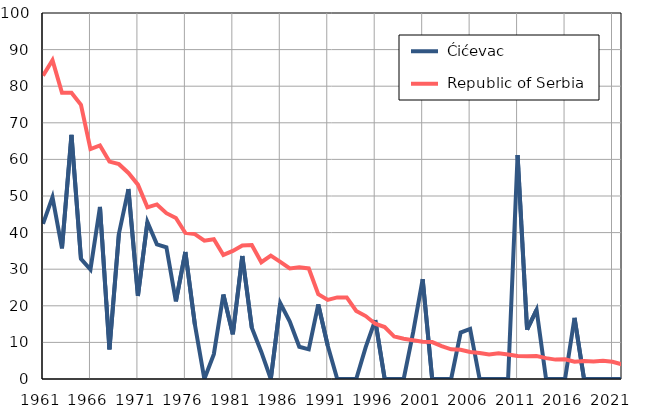
| Category |  Ćićevac |  Republic of Serbia |
|---|---|---|
| 1961.0 | 42.4 | 82.9 |
| 1962.0 | 49.7 | 87.1 |
| 1963.0 | 35.7 | 78.2 |
| 1964.0 | 66.7 | 78.2 |
| 1965.0 | 32.8 | 74.9 |
| 1966.0 | 29.9 | 62.8 |
| 1967.0 | 47 | 63.8 |
| 1968.0 | 8.1 | 59.4 |
| 1969.0 | 39.7 | 58.7 |
| 1970.0 | 51.9 | 56.3 |
| 1971.0 | 22.7 | 53.1 |
| 1972.0 | 42.9 | 46.9 |
| 1973.0 | 36.8 | 47.7 |
| 1974.0 | 36 | 45.3 |
| 1975.0 | 21.2 | 44 |
| 1976.0 | 34.7 | 39.9 |
| 1977.0 | 14.9 | 39.6 |
| 1978.0 | 0 | 37.8 |
| 1979.0 | 6.8 | 38.2 |
| 1980.0 | 23.1 | 33.9 |
| 1981.0 | 12.2 | 35 |
| 1982.0 | 33.6 | 36.5 |
| 1983.0 | 14 | 36.6 |
| 1984.0 | 7.4 | 31.9 |
| 1985.0 | 0 | 33.7 |
| 1986.0 | 20.7 | 32 |
| 1987.0 | 15.7 | 30.2 |
| 1988.0 | 8.8 | 30.5 |
| 1989.0 | 8.1 | 30.2 |
| 1990.0 | 20.4 | 23.2 |
| 1991.0 | 9.1 | 21.6 |
| 1992.0 | 0 | 22.3 |
| 1993.0 | 0 | 22.3 |
| 1994.0 | 0 | 18.6 |
| 1995.0 | 8.7 | 17.2 |
| 1996.0 | 16.1 | 15.1 |
| 1997.0 | 0 | 14.2 |
| 1998.0 | 0 | 11.6 |
| 1999.0 | 0 | 11 |
| 2000.0 | 12.8 | 10.6 |
| 2001.0 | 27.3 | 10.2 |
| 2002.0 | 0 | 10.1 |
| 2003.0 | 0 | 9 |
| 2004.0 | 0 | 8.1 |
| 2005.0 | 12.7 | 8 |
| 2006.0 | 13.7 | 7.4 |
| 2007.0 | 0 | 7.1 |
| 2008.0 | 0 | 6.7 |
| 2009.0 | 0 | 7 |
| 2010.0 | 0 | 6.7 |
| 2011.0 | 61.2 | 6.3 |
| 2012.0 | 13.5 | 6.2 |
| 2013.0 | 18.9 | 6.3 |
| 2014.0 | 0 | 5.7 |
| 2015.0 | 0 | 5.3 |
| 2016.0 | 0 | 5.4 |
| 2017.0 | 16.7 | 4.7 |
| 2018.0 | 0 | 4.9 |
| 2019.0 | 0 | 4.8 |
| 2020.0 | 0 | 5 |
| 2021.0 | 0 | 4.7 |
| 2022.0 | 0 | 4 |